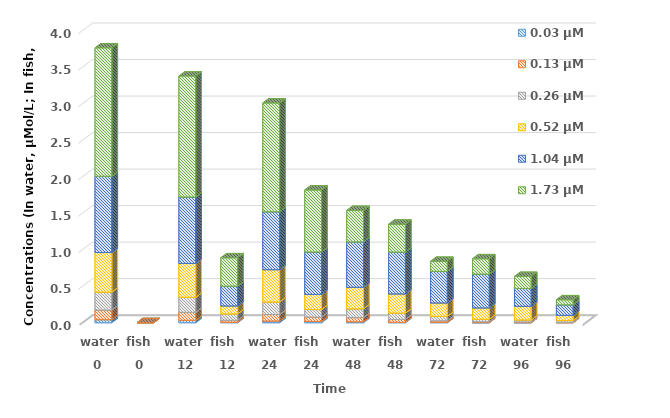
| Category | 0.03 μM | 0.13 μM | 0.26 μM | 0.52 μM | 1.04 μM | 1.73 μM |
|---|---|---|---|---|---|---|
| 0 | 0.042 | 0.132 | 0.246 | 0.542 | 1.044 | 1.758 |
| 1 | 0 | 0 | 0 | 0 | 0 | 0 |
| 2 | 0.033 | 0.109 | 0.206 | 0.464 | 0.909 | 1.656 |
| 3 | 0.007 | 0.027 | 0.087 | 0.109 | 0.271 | 0.389 |
| 4 | 0.024 | 0.089 | 0.171 | 0.443 | 0.794 | 1.49 |
| 5 | 0.018 | 0.06 | 0.103 | 0.207 | 0.581 | 0.849 |
| 6 | 0.013 | 0.057 | 0.121 | 0.294 | 0.622 | 0.431 |
| 7 | 0.006 | 0.039 | 0.087 | 0.263 | 0.572 | 0.382 |
| 8 | 0.004 | 0.023 | 0.061 | 0.183 | 0.432 | 0.138 |
| 9 | 0.001 | 0.013 | 0.033 | 0.156 | 0.463 | 0.21 |
| 10 | 0.001 | 0.01 | 0.027 | 0.187 | 0.244 | 0.165 |
| 11 | 0 | 0.006 | 0.024 | 0.072 | 0.143 | 0.069 |